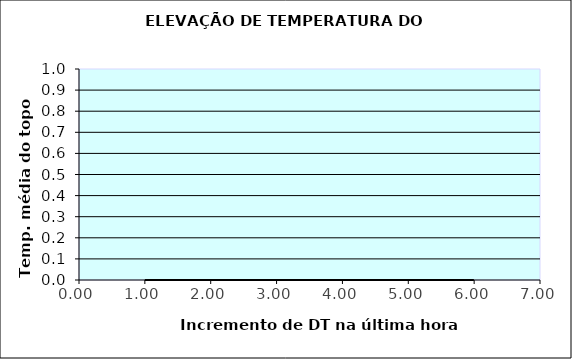
| Category | ELEVAÇÃO DE TEMPERATURA DO ÓLEO |
|---|---|
| 0 | 0 |
| 1 | 0 |
| 2 | 0 |
| 3 | 0 |
| 4 | 0 |
| 5 | 0 |